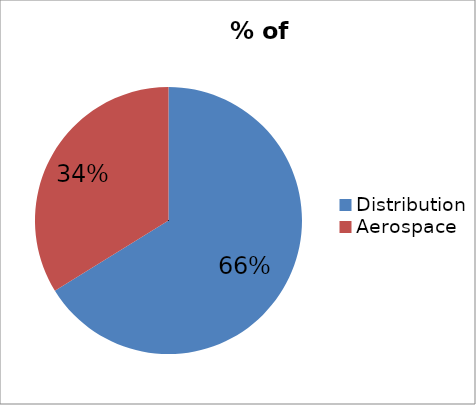
| Category | % of sales |
|---|---|
| Distribution | 0.662 |
| Aerospace | 0.338 |